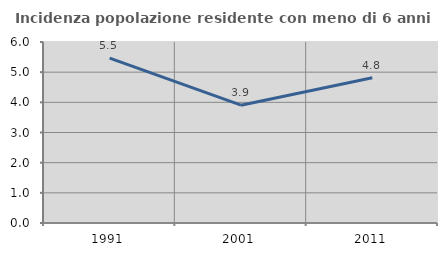
| Category | Incidenza popolazione residente con meno di 6 anni |
|---|---|
| 1991.0 | 5.468 |
| 2001.0 | 3.905 |
| 2011.0 | 4.813 |